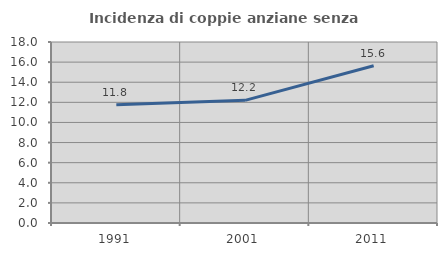
| Category | Incidenza di coppie anziane senza figli  |
|---|---|
| 1991.0 | 11.759 |
| 2001.0 | 12.198 |
| 2011.0 | 15.642 |